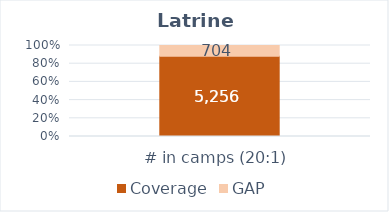
| Category |  Coverage  |  GAP  |
|---|---|---|
|  # in camps (20:1)  | 5256 | 704 |